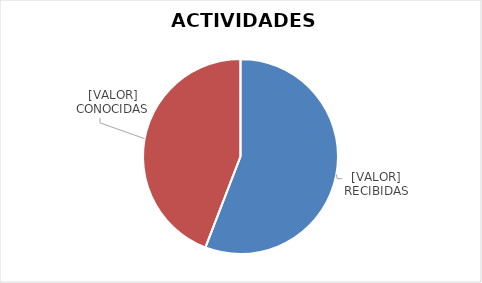
| Category | Series 0 |
|---|---|
| 0 | 124 |
| 1 | 98 |